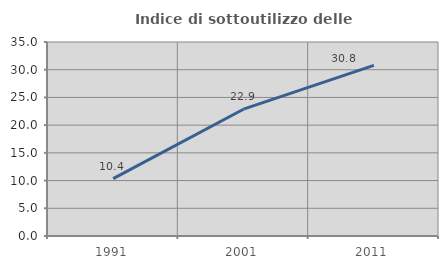
| Category | Indice di sottoutilizzo delle abitazioni  |
|---|---|
| 1991.0 | 10.352 |
| 2001.0 | 22.876 |
| 2011.0 | 30.769 |